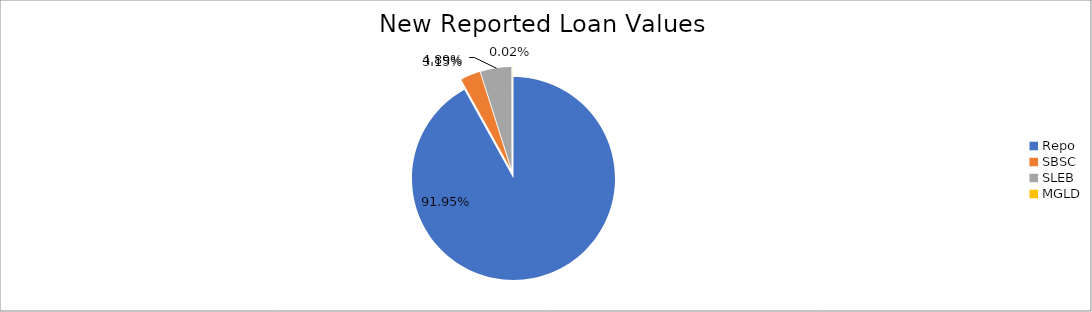
| Category | Series 0 |
|---|---|
| Repo | 9430056.178 |
| SBSC | 322775.099 |
| SLEB | 501472.603 |
| MGLD | 1888.272 |